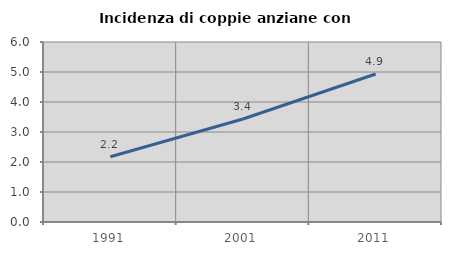
| Category | Incidenza di coppie anziane con figli |
|---|---|
| 1991.0 | 2.177 |
| 2001.0 | 3.432 |
| 2011.0 | 4.934 |